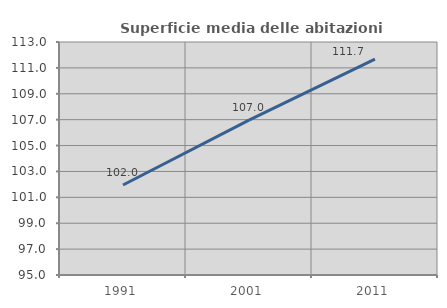
| Category | Superficie media delle abitazioni occupate |
|---|---|
| 1991.0 | 101.952 |
| 2001.0 | 106.969 |
| 2011.0 | 111.682 |